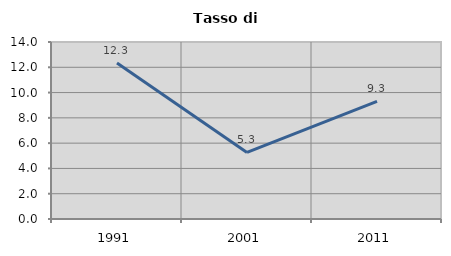
| Category | Tasso di disoccupazione   |
|---|---|
| 1991.0 | 12.346 |
| 2001.0 | 5.263 |
| 2011.0 | 9.302 |